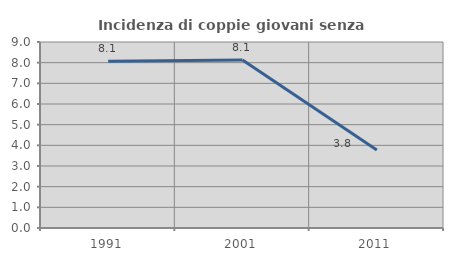
| Category | Incidenza di coppie giovani senza figli |
|---|---|
| 1991.0 | 8.07 |
| 2001.0 | 8.131 |
| 2011.0 | 3.773 |